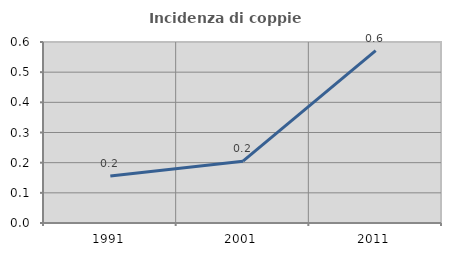
| Category | Incidenza di coppie miste |
|---|---|
| 1991.0 | 0.156 |
| 2001.0 | 0.205 |
| 2011.0 | 0.571 |